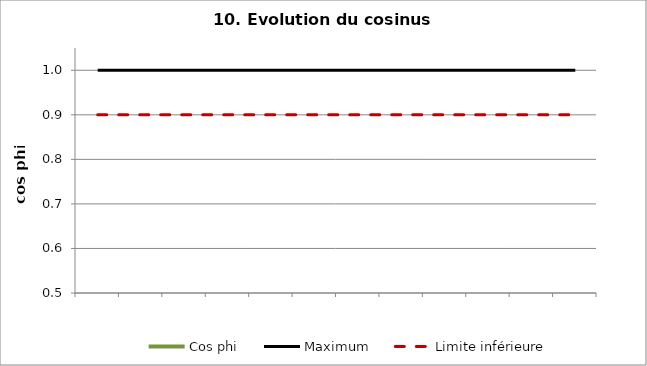
| Category | Cos phi | Maximum | Limite inférieure |
|---|---|---|---|
| 0 | 0 |  |  |
| 1900-01-01 | 0 |  |  |
| 1900-01-02 | 0 |  |  |
| 1900-01-03 | 0 |  |  |
| 1900-01-04 | 0 |  |  |
| 1900-01-05 | 0 |  |  |
| 1900-01-06 | 0 |  |  |
| 1900-01-07 | 0 |  |  |
| 1900-01-08 | 0 |  |  |
| 1900-01-09 | 0 |  |  |
| 1900-01-10 | 0 |  |  |
| 1900-01-11 | 0 |  |  |